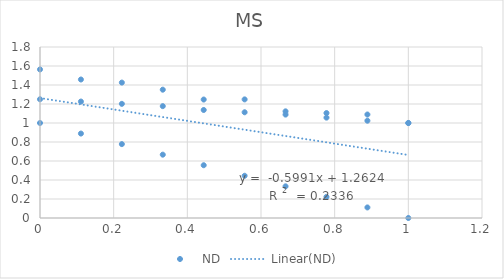
| Category | ND |
|---|---|
| 1.0 | 1 |
| 0.8888888888888888 | 1.089 |
| 0.7777777777777778 | 1.105 |
| 0.6666666666666666 | 1.123 |
| 0.5555555555555556 | 1.249 |
| 0.4444444444444444 | 1.247 |
| 0.3333333333333333 | 1.351 |
| 0.2222222222222222 | 1.425 |
| 0.1111111111111111 | 1.458 |
| 0.0 | 1.564 |
| 1.0 | 1 |
| 0.8888892831795598 | 1.024 |
| 0.7777785663591198 | 1.056 |
| 0.6666678495386796 | 1.089 |
| 0.5555571327182395 | 1.113 |
| 0.4444464158977994 | 1.137 |
| 0.3333356990773592 | 1.177 |
| 0.2222249822569191 | 1.202 |
| 0.11111426543647898 | 1.226 |
| 0.0 | 1.25 |
| 0.0 | 1 |
| 0.11111071682044013 | 0.889 |
| 0.22222143364088026 | 0.778 |
| 0.33333215046132036 | 0.667 |
| 0.4444428672817605 | 0.556 |
| 0.5555535841022007 | 0.444 |
| 0.6666643009226407 | 0.333 |
| 0.7777750177430809 | 0.222 |
| 0.888885734563521 | 0.111 |
| 0.9999964513839611 | 0 |